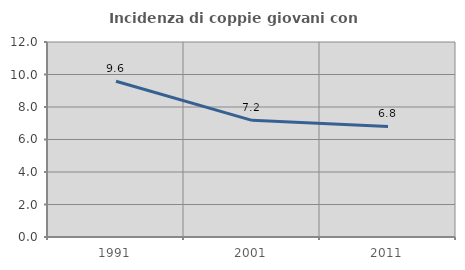
| Category | Incidenza di coppie giovani con figli |
|---|---|
| 1991.0 | 9.583 |
| 2001.0 | 7.177 |
| 2011.0 | 6.806 |